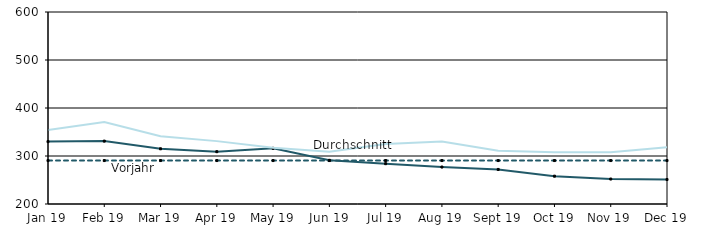
| Category | Berichtsjahr | Durchschnitt | Vorjahr |
|---|---|---|---|
| 2019-01-01 | 330 | 290.5 | 354 |
| 2019-02-01 | 331 | 290.5 | 371 |
| 2019-03-01 | 315 | 290.5 | 341 |
| 2019-04-01 | 309 | 290.5 | 331 |
| 2019-05-01 | 316 | 290.5 | 317 |
| 2019-06-01 | 291 | 290.5 | 309 |
| 2019-07-01 | 284 | 290.5 | 325 |
| 2019-08-01 | 277 | 290.5 | 330 |
| 2019-09-01 | 272 | 290.5 | 311 |
| 2019-10-01 | 258 | 290.5 | 308 |
| 2019-11-01 | 252 | 290.5 | 308 |
| 2019-12-01 | 251 | 290.5 | 318 |